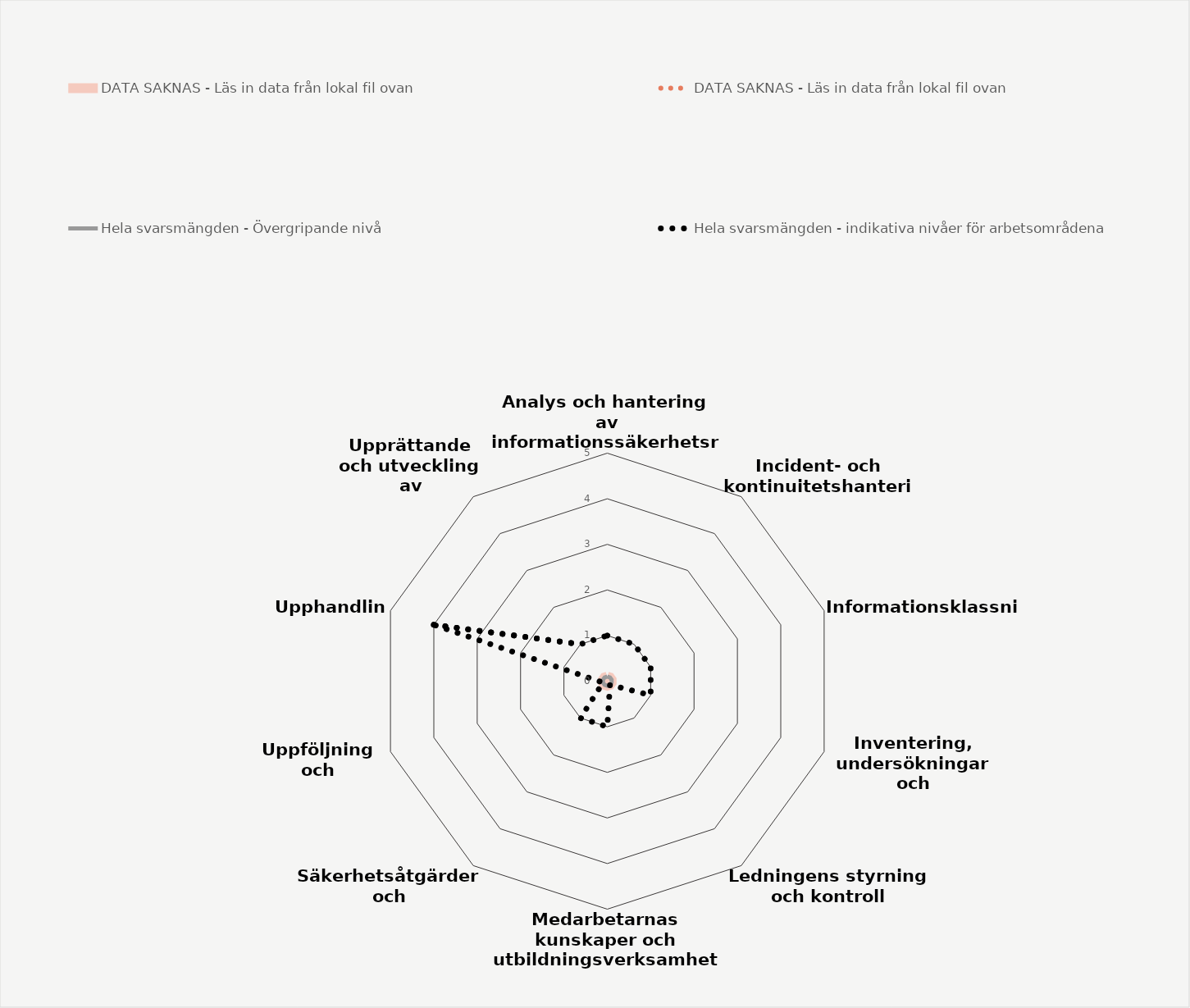
| Category | DATA SAKNAS - Läs in data från lokal fil ovan | Hela svarsmängden - Övergripande nivå | Hela svarsmängden - indikativa nivåer för arbetsområdena |
|---|---|---|---|
| Analys och hantering av informationssäkerhetsrisker | 0 | 0.1 | 1 |
| Incident- och kontinuitetshantering | 0 | 0.1 | 1 |
| Informationsklassning | 0 | 0.1 | 1 |
| Inventering, undersökningar och omvärldsbevakning | 0 | 0.1 | 1 |
| Ledningens styrning och kontroll | 0 | 0.1 | 0.1 |
| Medarbetarnas kunskaper och utbildningsverksamhet | 0 | 0.1 | 1 |
| Säkerhetsåtgärder och förbättringsarbete | 0 | 0.1 | 1 |
| Uppföljning och utvärdering | 0 | 0.1 | 0.1 |
| Upphandling | 0 | 0.1 | 4 |
| Upprättande och utveckling av säkerhetskultur | 0 | 0.1 | 1 |